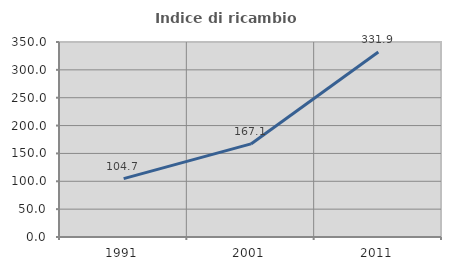
| Category | Indice di ricambio occupazionale  |
|---|---|
| 1991.0 | 104.735 |
| 2001.0 | 167.067 |
| 2011.0 | 331.926 |